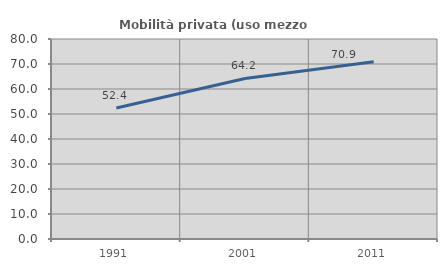
| Category | Mobilità privata (uso mezzo privato) |
|---|---|
| 1991.0 | 52.431 |
| 2001.0 | 64.212 |
| 2011.0 | 70.896 |